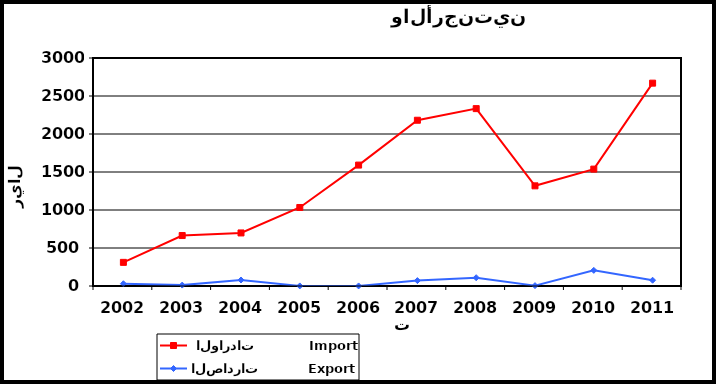
| Category |  الواردات           Import | الصادرات          Export |
|---|---|---|
| 2002.0 | 311 | 30 |
| 2003.0 | 664 | 12 |
| 2004.0 | 698 | 79 |
| 2005.0 | 1033 | 1 |
| 2006.0 | 1591 | 1 |
| 2007.0 | 2181 | 71 |
| 2008.0 | 2334 | 109 |
| 2009.0 | 1318 | 5 |
| 2010.0 | 1538 | 206 |
| 2011.0 | 2669 | 76 |